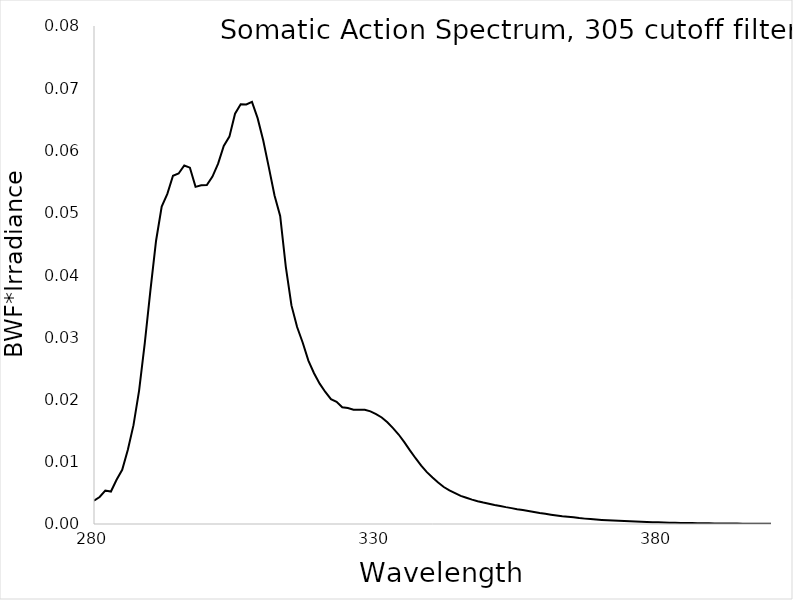
| Category | BWF |
|---|---|
| 280.0 | 0.004 |
| 281.0 | 0.004 |
| 282.0 | 0.005 |
| 283.0 | 0.005 |
| 284.0 | 0.007 |
| 285.0 | 0.009 |
| 286.0 | 0.012 |
| 287.0 | 0.016 |
| 288.0 | 0.021 |
| 289.0 | 0.029 |
| 290.0 | 0.038 |
| 291.0 | 0.046 |
| 292.0 | 0.051 |
| 293.0 | 0.053 |
| 294.0 | 0.056 |
| 295.0 | 0.056 |
| 296.0 | 0.058 |
| 297.0 | 0.057 |
| 298.0 | 0.054 |
| 299.0 | 0.054 |
| 300.0 | 0.054 |
| 301.0 | 0.056 |
| 302.0 | 0.058 |
| 303.0 | 0.061 |
| 304.0 | 0.062 |
| 305.0 | 0.066 |
| 306.0 | 0.067 |
| 307.0 | 0.067 |
| 308.0 | 0.068 |
| 309.0 | 0.065 |
| 310.0 | 0.062 |
| 311.0 | 0.057 |
| 312.0 | 0.053 |
| 313.0 | 0.049 |
| 314.0 | 0.041 |
| 315.0 | 0.035 |
| 316.0 | 0.032 |
| 317.0 | 0.029 |
| 318.0 | 0.026 |
| 319.0 | 0.024 |
| 320.0 | 0.023 |
| 321.0 | 0.021 |
| 322.0 | 0.02 |
| 323.0 | 0.02 |
| 324.0 | 0.019 |
| 325.0 | 0.019 |
| 326.0 | 0.018 |
| 327.0 | 0.018 |
| 328.0 | 0.018 |
| 329.0 | 0.018 |
| 330.0 | 0.018 |
| 331.0 | 0.017 |
| 332.0 | 0.016 |
| 333.0 | 0.015 |
| 334.0 | 0.014 |
| 335.0 | 0.013 |
| 336.0 | 0.012 |
| 337.0 | 0.011 |
| 338.0 | 0.009 |
| 339.0 | 0.008 |
| 340.0 | 0.007 |
| 341.0 | 0.007 |
| 342.0 | 0.006 |
| 343.0 | 0.005 |
| 344.0 | 0.005 |
| 345.0 | 0.005 |
| 346.0 | 0.004 |
| 347.0 | 0.004 |
| 348.0 | 0.004 |
| 349.0 | 0.003 |
| 350.0 | 0.003 |
| 351.0 | 0.003 |
| 352.0 | 0.003 |
| 353.0 | 0.003 |
| 354.0 | 0.003 |
| 355.0 | 0.002 |
| 356.0 | 0.002 |
| 357.0 | 0.002 |
| 358.0 | 0.002 |
| 359.0 | 0.002 |
| 360.0 | 0.002 |
| 361.0 | 0.001 |
| 362.0 | 0.001 |
| 363.0 | 0.001 |
| 364.0 | 0.001 |
| 365.0 | 0.001 |
| 366.0 | 0.001 |
| 367.0 | 0.001 |
| 368.0 | 0.001 |
| 369.0 | 0.001 |
| 370.0 | 0.001 |
| 371.0 | 0.001 |
| 372.0 | 0.001 |
| 373.0 | 0.001 |
| 374.0 | 0 |
| 375.0 | 0 |
| 376.0 | 0 |
| 377.0 | 0 |
| 378.0 | 0 |
| 379.0 | 0 |
| 380.0 | 0 |
| 381.0 | 0 |
| 382.0 | 0 |
| 383.0 | 0 |
| 384.0 | 0 |
| 385.0 | 0 |
| 386.0 | 0 |
| 387.0 | 0 |
| 388.0 | 0 |
| 389.0 | 0 |
| 390.0 | 0 |
| 391.0 | 0 |
| 392.0 | 0 |
| 393.0 | 0 |
| 394.0 | 0 |
| 395.0 | 0 |
| 396.0 | 0 |
| 397.0 | 0 |
| 398.0 | 0 |
| 399.0 | 0 |
| 400.0 | 0 |
| 401.0 | 0 |
| 402.0 | 0 |
| 403.0 | 0 |
| 404.0 | 0 |
| 405.0 | 0 |
| 406.0 | 0 |
| 407.0 | 0 |
| 408.0 | 0 |
| 409.0 | 0 |
| 410.0 | 0 |
| 411.0 | 0 |
| 412.0 | 0 |
| 413.0 | 0 |
| 414.0 | 0 |
| 415.0 | 0 |
| 416.0 | 0 |
| 417.0 | 0 |
| 418.0 | 0 |
| 419.0 | 0 |
| 420.0 | 0 |
| 421.0 | 0 |
| 422.0 | 0 |
| 423.0 | 0 |
| 424.0 | 0 |
| 425.0 | 0 |
| 426.0 | 0 |
| 427.0 | 0 |
| 428.0 | 0 |
| 429.0 | 0 |
| 430.0 | 0 |
| 431.0 | 0 |
| 432.0 | 0 |
| 433.0 | 0 |
| 434.0 | 0 |
| 435.0 | 0 |
| 436.0 | 0 |
| 437.0 | 0 |
| 438.0 | 0 |
| 439.0 | 0 |
| 440.0 | 0 |
| 441.0 | 0 |
| 442.0 | 0 |
| 443.0 | 0 |
| 444.0 | 0 |
| 445.0 | 0 |
| 446.0 | 0 |
| 447.0 | 0 |
| 448.0 | 0 |
| 449.0 | 0 |
| 450.0 | 0 |
| 451.0 | 0 |
| 452.0 | 0 |
| 453.0 | 0 |
| 454.0 | 0 |
| 455.0 | 0 |
| 456.0 | 0 |
| 457.0 | 0 |
| 458.0 | 0 |
| 459.0 | 0 |
| 460.0 | 0 |
| 461.0 | 0 |
| 462.0 | 0 |
| 463.0 | 0 |
| 464.0 | 0 |
| 465.0 | 0 |
| 466.0 | 0 |
| 467.0 | 0 |
| 468.0 | 0 |
| 469.0 | 0 |
| 470.0 | 0 |
| 471.0 | 0 |
| 472.0 | 0 |
| 473.0 | 0 |
| 474.0 | 0 |
| 475.0 | 0 |
| 476.0 | 0 |
| 477.0 | 0 |